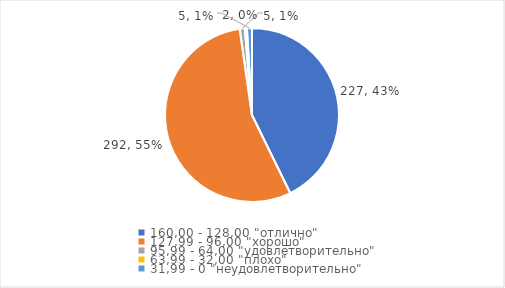
| Category | Series 0 | Series 1 |
|---|---|---|
| 160,00 - 128,00 "отлично" | 227 | 0.427 |
| 127,99 - 96,00 "хорошо" | 292 | 0.55 |
| 95,99 - 64,00 "удовлетворительно" | 5 | 0.009 |
| 63,99 - 32,00 "плохо" | 2 | 0.004 |
| 31,99 - 0 "неудовлетворительно" | 5 | 0.009 |